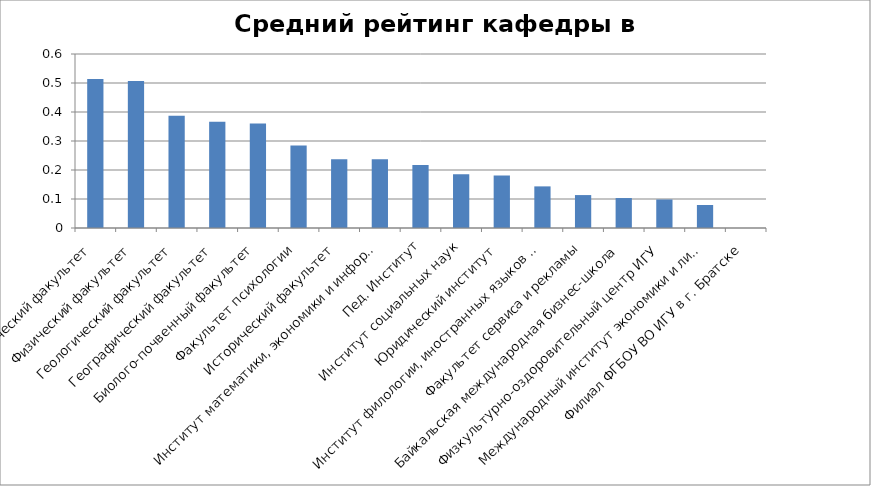
| Category | Средний рейтинг кафедры в подразделении |
|---|---|
| Химический факультет | 0.514 |
| Физический факультет | 0.507 |
| Геологический факультет | 0.387 |
| Географический факультет | 0.367 |
| Биолого-почвенный факультет | 0.36 |
| Факультет психологии | 0.285 |
| Исторический факультет | 0.237 |
| Институт математики, экономики и информатики | 0.237 |
| Пед. Институт | 0.217 |
| Институт социальных наук | 0.185 |
| Юридический институт | 0.181 |
| Институт филологии, иностранных языков и медиакоммуникации | 0.144 |
| Факультет сервиса и рекламы | 0.114 |
| Байкальская международная бизнес-школа | 0.103 |
| Физкультурно-оздоровительный центр ИГУ | 0.098 |
| Международный институт экономики и лингвистики | 0.079 |
| Филиал ФГБОУ ВО ИГУ в г. Братске | 0 |